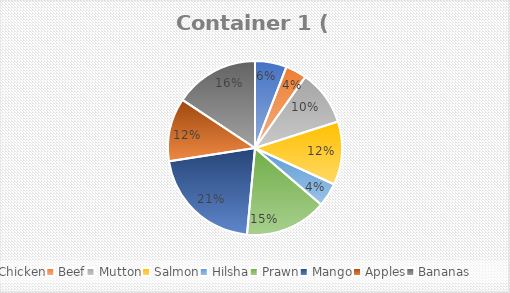
| Category | Container 1 ( kg) |
|---|---|
| Chicken | 120 |
| Beef | 80 |
| Mutton | 210 |
| Salmon | 240 |
| Hilsha | 90 |
| Prawn | 310 |
| Mango | 430 |
| Apples | 240 |
| Bananas | 320 |